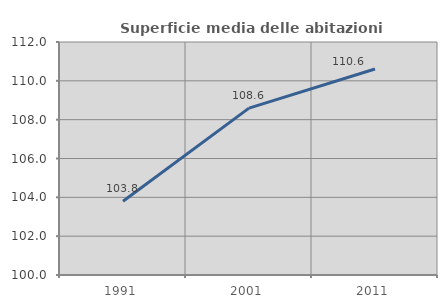
| Category | Superficie media delle abitazioni occupate |
|---|---|
| 1991.0 | 103.799 |
| 2001.0 | 108.593 |
| 2011.0 | 110.607 |